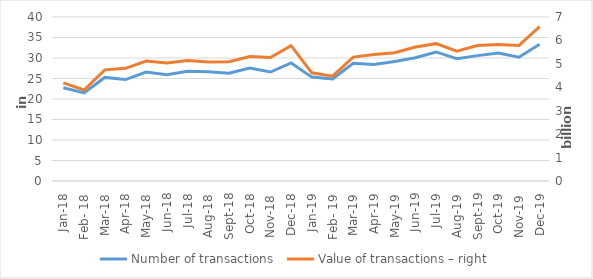
| Category | Number of transactions  |
|---|---|
| sij.18 | 22739869 |
| Feb- 18 | 21499774 |
| ožu.18 | 25262023 |
| tra.18 | 24744189 |
| svi.18 | 26558048 |
| lip.18 | 25924432 |
| srp.18 | 26737951 |
| kol.18 | 26666785 |
| ruj.18 | 26280494 |
| lis.18 | 27535530 |
| stu.18 | 26580646 |
| pro.18 | 28788103 |
| sij.19 | 25337861 |
| Feb- 19 | 24877501 |
| ožu.19 | 28696517 |
| tra.19 | 28389936 |
| svi.19 | 29168602 |
| lip.19 | 30050923 |
| srp.19 | 31477207 |
| kol.19 | 29816249 |
| ruj.19 | 30580830 |
| lis.19 | 31225999 |
| stu.19 | 30198337 |
| pro.19 | 33337111 |